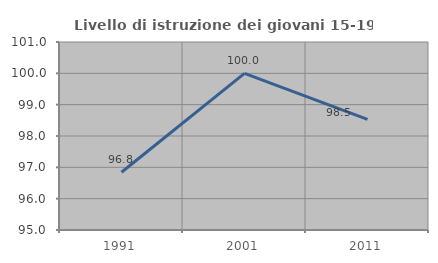
| Category | Livello di istruzione dei giovani 15-19 anni |
|---|---|
| 1991.0 | 96.842 |
| 2001.0 | 100 |
| 2011.0 | 98.529 |